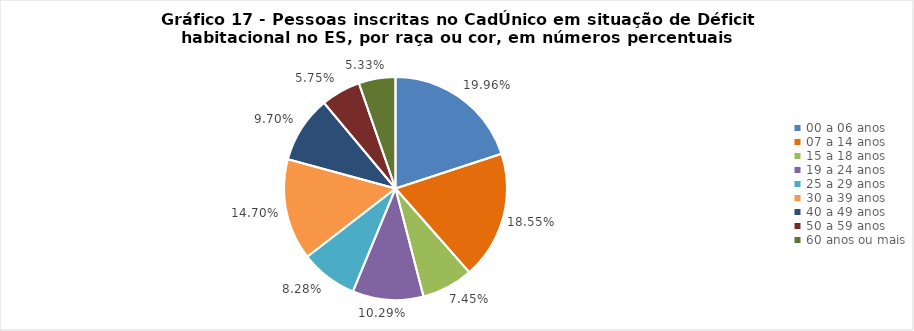
| Category | Series 0 |
|---|---|
| 00 a 06 anos | 0.2 |
| 07 a 14 anos | 0.185 |
| 15 a 18 anos | 0.075 |
| 19 a 24 anos | 0.103 |
| 25 a 29 anos | 0.083 |
| 30 a 39 anos | 0.147 |
| 40 a 49 anos | 0.097 |
| 50 a 59 anos | 0.057 |
| 60 anos ou mais | 0.053 |